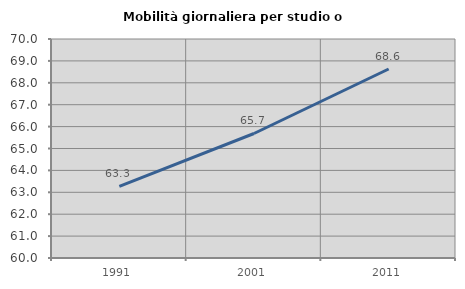
| Category | Mobilità giornaliera per studio o lavoro |
|---|---|
| 1991.0 | 63.274 |
| 2001.0 | 65.685 |
| 2011.0 | 68.631 |